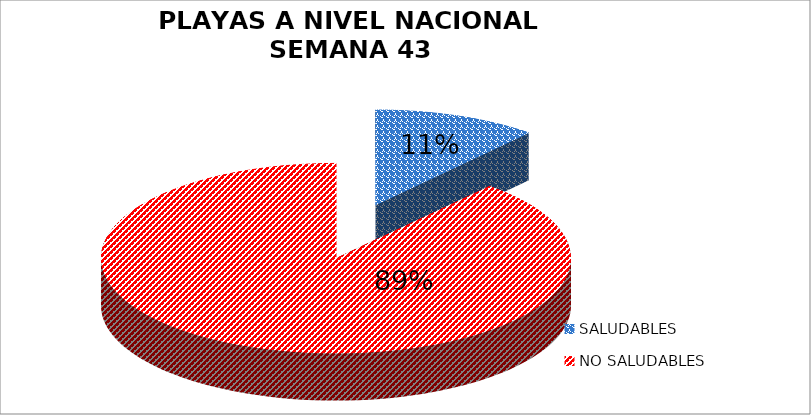
| Category | N.° |
|---|---|
| SALUDABLES | 15 |
| NO SALUDABLES | 118 |